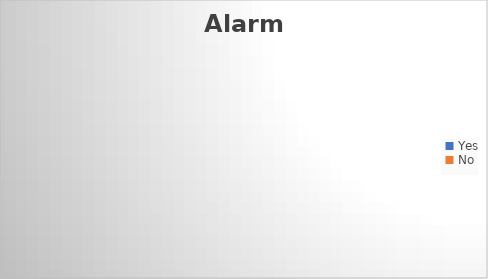
| Category | Alarm |
|---|---|
| Yes | 0 |
| No | 0 |